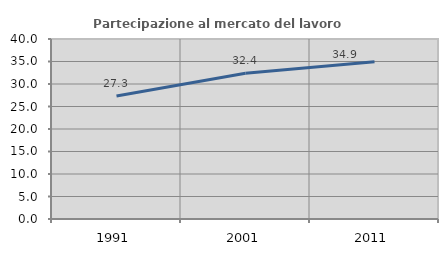
| Category | Partecipazione al mercato del lavoro  femminile |
|---|---|
| 1991.0 | 27.329 |
| 2001.0 | 32.392 |
| 2011.0 | 34.925 |